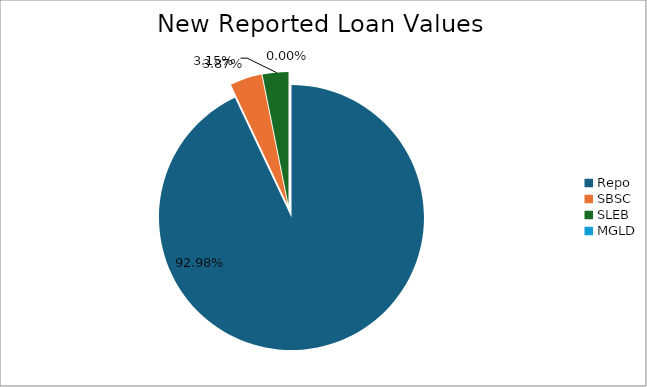
| Category | Series 0 |
|---|---|
| Repo | 13487769.212 |
| SBSC | 561746.738 |
| SLEB | 456454.677 |
| MGLD | 216.958 |